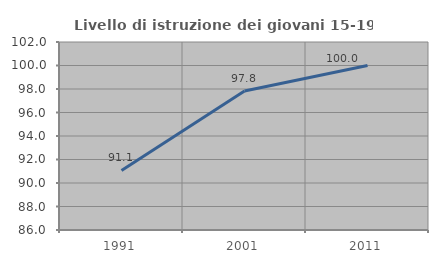
| Category | Livello di istruzione dei giovani 15-19 anni |
|---|---|
| 1991.0 | 91.071 |
| 2001.0 | 97.826 |
| 2011.0 | 100 |